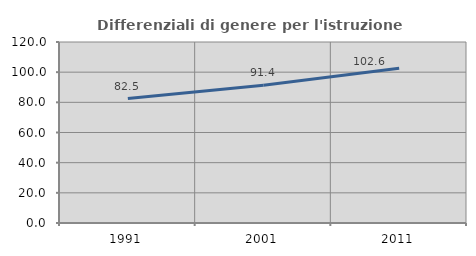
| Category | Differenziali di genere per l'istruzione superiore |
|---|---|
| 1991.0 | 82.493 |
| 2001.0 | 91.384 |
| 2011.0 | 102.567 |